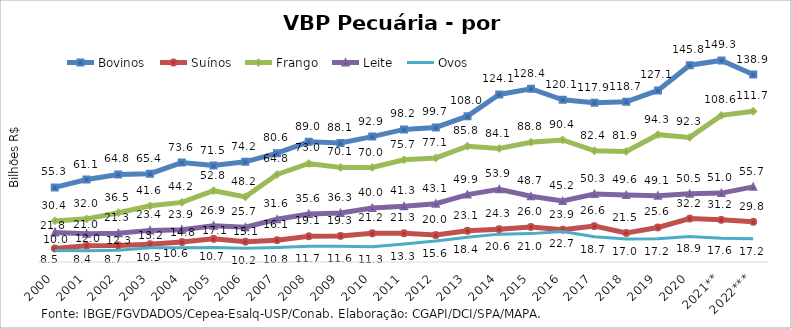
| Category | Bovinos | Suínos | Frango | Leite | Ovos |
|---|---|---|---|---|---|
| 2000 | 55.269 | 10.007 | 30.412 | 21.831 | 8.536 |
| 2001 | 61.095 | 12.006 | 31.966 | 21.007 | 8.411 |
| 2002 | 64.833 | 12.305 | 36.488 | 21.272 | 8.666 |
| 2003 | 65.434 | 13.151 | 41.599 | 23.425 | 10.482 |
| 2004 | 73.621 | 14.786 | 44.172 | 23.941 | 10.624 |
| 2005 | 71.475 | 17.143 | 52.811 | 26.927 | 10.696 |
| 2006 | 74.209 | 15.08 | 48.245 | 25.72 | 10.16 |
| 2007 | 80.648 | 16.125 | 64.822 | 31.619 | 10.798 |
| 2008 | 89.045 | 19.093 | 72.969 | 35.569 | 11.662 |
| 2009 | 88.116 | 19.301 | 70.06 | 36.263 | 11.628 |
| 2010 | 92.901 | 21.233 | 69.976 | 40.048 | 11.309 |
| 2011 | 98.211 | 21.266 | 75.682 | 41.285 | 13.326 |
| 2012 | 99.674 | 19.968 | 77.095 | 43.141 | 15.622 |
| 2013 | 108.012 | 23.119 | 85.807 | 49.922 | 18.373 |
| 2014 | 124.086 | 24.283 | 84.072 | 53.909 | 20.643 |
| 2015 | 128.356 | 25.951 | 88.754 | 48.663 | 21.019 |
| 2016 | 120.148 | 23.949 | 90.434 | 45.153 | 22.66 |
| 2017 | 117.904 | 26.586 | 82.37 | 50.31 | 18.677 |
| 2018 | 118.694 | 21.531 | 81.921 | 49.562 | 16.984 |
| 2019 | 127.095 | 25.592 | 94.323 | 49.103 | 17.201 |
| 2020 | 145.786 | 32.168 | 92.283 | 50.485 | 18.89 |
| 2021** | 149.318 | 31.244 | 108.601 | 51.037 | 17.604 |
| 2022*** | 138.86 | 29.763 | 111.689 | 55.66 | 17.19 |